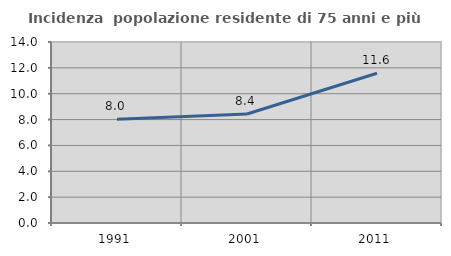
| Category | Incidenza  popolazione residente di 75 anni e più |
|---|---|
| 1991.0 | 8.024 |
| 2001.0 | 8.432 |
| 2011.0 | 11.583 |